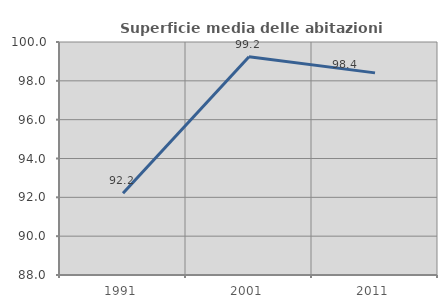
| Category | Superficie media delle abitazioni occupate |
|---|---|
| 1991.0 | 92.209 |
| 2001.0 | 99.244 |
| 2011.0 | 98.409 |